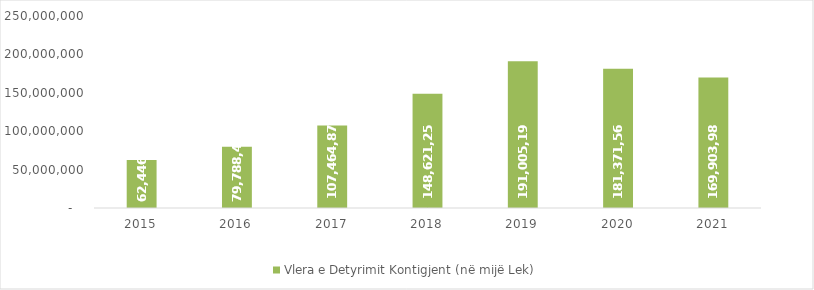
| Category | Vlera e Detyrimit Kontigjent (në mijë Lek) |
|---|---|
| 2015.0 | 62446285 |
| 2016.0 | 79788457 |
| 2017.0 | 107464879 |
| 2018.0 | 148621256 |
| 2019.0 | 191005197 |
| 2020.0 | 181371561 |
| 2021.0 | 169903985 |